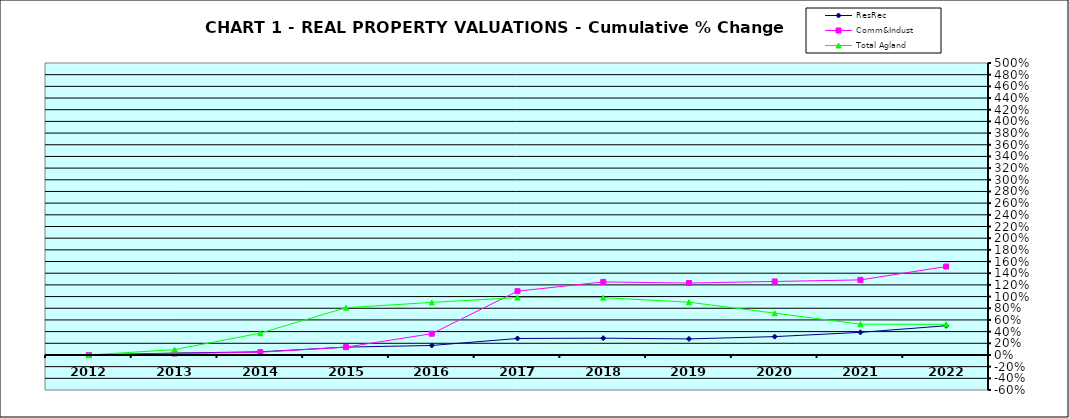
| Category | ResRec | Comm&Indust | Total Agland |
|---|---|---|---|
| 2012.0 | 0 | 0 | 0 |
| 2013.0 | 0.032 | 0.024 | 0.091 |
| 2014.0 | 0.054 | 0.048 | 0.374 |
| 2015.0 | 0.134 | 0.134 | 0.809 |
| 2016.0 | 0.163 | 0.365 | 0.9 |
| 2017.0 | 0.282 | 1.093 | 0.983 |
| 2018.0 | 0.288 | 1.251 | 0.982 |
| 2019.0 | 0.275 | 1.232 | 0.903 |
| 2020.0 | 0.314 | 1.258 | 0.717 |
| 2021.0 | 0.387 | 1.286 | 0.527 |
| 2022.0 | 0.5 | 1.514 | 0.525 |